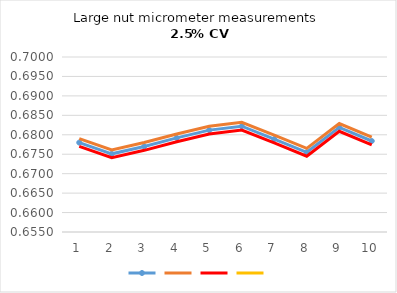
| Category | Series 0 | Series 1 | Series 2 | Series 3 |
|---|---|---|---|---|
| 0 | 0.678 | 0.679 | 0.677 |  |
| 1 | 0.675 | 0.676 | 0.674 |  |
| 2 | 0.677 | 0.678 | 0.676 |  |
| 3 | 0.679 | 0.68 | 0.678 |  |
| 4 | 0.681 | 0.682 | 0.68 |  |
| 5 | 0.682 | 0.683 | 0.681 |  |
| 6 | 0.679 | 0.68 | 0.678 |  |
| 7 | 0.675 | 0.676 | 0.674 |  |
| 8 | 0.682 | 0.683 | 0.681 |  |
| 9 | 0.678 | 0.679 | 0.677 |  |